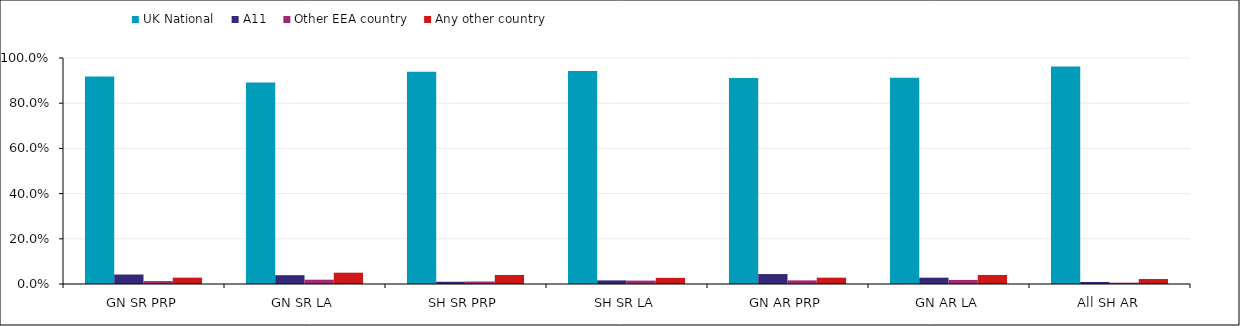
| Category | UK National | A11 | Other EEA country | Any other country |
|---|---|---|---|---|
| GN SR PRP | 0.918 | 0.042 | 0.013 | 0.028 |
| GN SR LA | 0.892 | 0.039 | 0.019 | 0.05 |
| SH SR PRP | 0.939 | 0.01 | 0.011 | 0.04 |
| SH SR LA | 0.943 | 0.016 | 0.015 | 0.027 |
| GN AR PRP | 0.912 | 0.044 | 0.016 | 0.028 |
| GN AR LA | 0.913 | 0.028 | 0.018 | 0.04 |
| All SH AR | 0.962 | 0.009 | 0.006 | 0.022 |